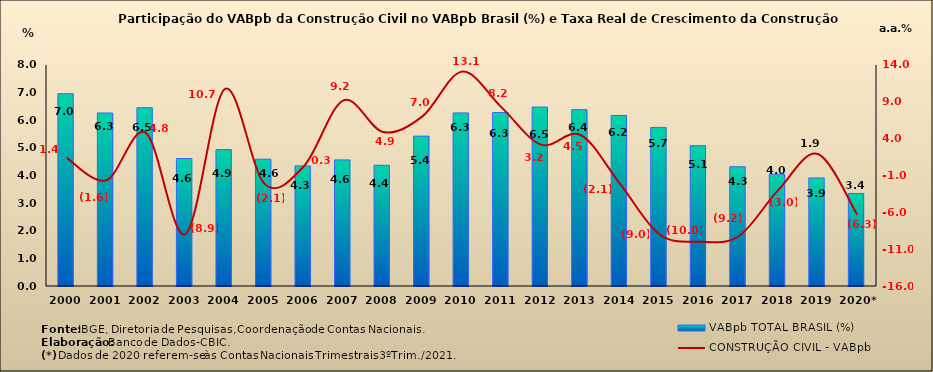
| Category | VABpb TOTAL BRASIL (%) |
|---|---|
| 2000 | 6.96 |
| 2001 | 6.264 |
| 2002 | 6.454 |
| 2003 | 4.615 |
| 2004 | 4.937 |
| 2005 | 4.589 |
| 2006 | 4.348 |
| 2007 | 4.564 |
| 2008 | 4.371 |
| 2009 | 5.426 |
| 2010 | 6.265 |
| 2011 | 6.277 |
| 2012 | 6.478 |
| 2013 | 6.382 |
| 2014 | 6.173 |
| 2015 | 5.742 |
| 2016 | 5.077 |
| 2017 | 4.316 |
| 2018 | 4.047 |
| 2019 | 3.912 |
| 2020* | 3.351 |